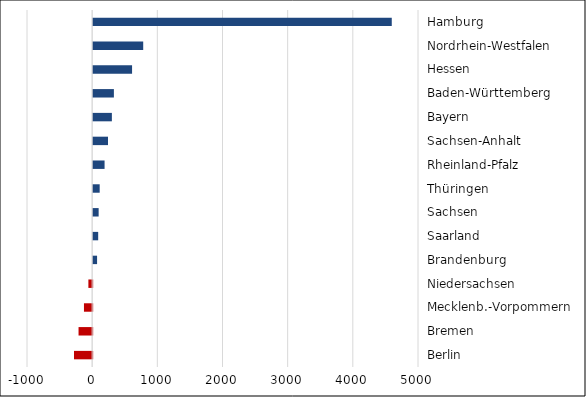
| Category | Series 0 |
|---|---|
| Berlin | -279 |
| Bremen | -209 |
| Mecklenb.-Vorpommern | -126 |
| Niedersachsen | -58 |
| Brandenburg | 60 |
| Saarland | 77 |
| Sachsen | 84 |
| Thüringen | 100 |
| Rheinland-Pfalz | 175 |
| Sachsen-Anhalt | 228 |
| Bayern | 287 |
| Baden-Württemberg | 318 |
| Hessen | 597 |
| Nordrhein-Westfalen | 768 |
| Hamburg | 4582 |